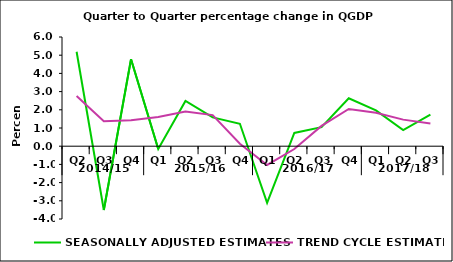
| Category | SEASONALLY ADJUSTED ESTIMATES | TREND CYCLE ESTIMATES |
|---|---|---|
| 0 | 5.188 | 2.753 |
| 1 | -3.504 | 1.373 |
| 2 | 4.782 | 1.428 |
| 3 | -0.155 | 1.605 |
| 4 | 2.485 | 1.907 |
| 5 | 1.582 | 1.707 |
| 6 | 1.231 | 0.135 |
| 7 | -3.118 | -1.029 |
| 8 | 0.73 | -0.155 |
| 9 | 1.047 | 1.114 |
| 10 | 2.633 | 2.047 |
| 11 | 1.969 | 1.834 |
| 12 | 0.887 | 1.46 |
| 13 | 1.74 | 1.252 |